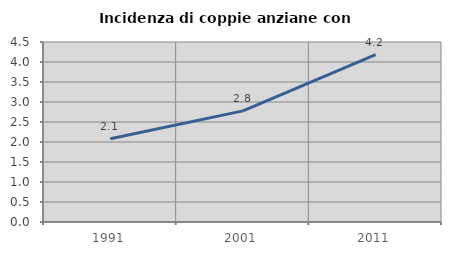
| Category | Incidenza di coppie anziane con figli |
|---|---|
| 1991.0 | 2.083 |
| 2001.0 | 2.778 |
| 2011.0 | 4.186 |